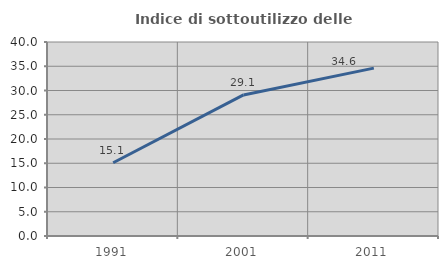
| Category | Indice di sottoutilizzo delle abitazioni  |
|---|---|
| 1991.0 | 15.094 |
| 2001.0 | 29.091 |
| 2011.0 | 34.615 |